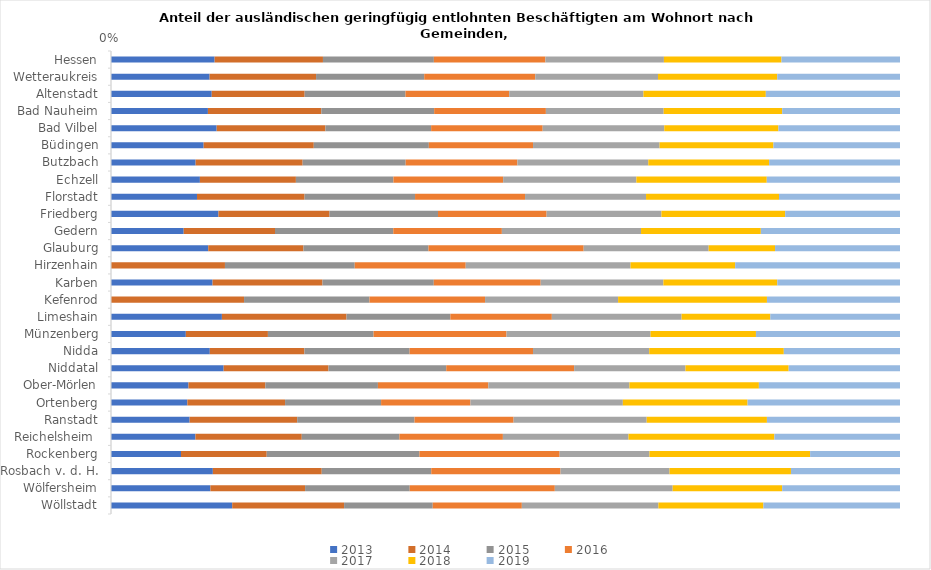
| Category | 2013 | 2014 | 2015 | 2016 | 2017 | 2018 | 2019 |
|---|---|---|---|---|---|---|---|
| Hessen | 0.142 | 0.149 | 0.152 | 0.153 | 0.163 | 0.161 | 0.163 |
| Wetteraukreis | 0.102 | 0.11 | 0.112 | 0.115 | 0.127 | 0.123 | 0.127 |
| Altenstadt | 0.107 | 0.099 | 0.107 | 0.111 | 0.143 | 0.13 | 0.143 |
| Bad Nauheim | 0.137 | 0.16 | 0.16 | 0.158 | 0.167 | 0.168 | 0.167 |
| Bad Vilbel | 0.163 | 0.167 | 0.163 | 0.172 | 0.187 | 0.176 | 0.187 |
| Büdingen | 0.083 | 0.099 | 0.103 | 0.093 | 0.113 | 0.102 | 0.113 |
| Butzbach | 0.071 | 0.09 | 0.087 | 0.094 | 0.11 | 0.101 | 0.11 |
| Echzell | 0.073 | 0.079 | 0.08 | 0.09 | 0.109 | 0.107 | 0.109 |
| Florstadt | 0.053 | 0.066 | 0.068 | 0.068 | 0.074 | 0.082 | 0.074 |
| Friedberg | 0.177 | 0.183 | 0.179 | 0.179 | 0.189 | 0.204 | 0.189 |
| Gedern | 0.045 | 0.056 | 0.073 | 0.067 | 0.086 | 0.074 | 0.086 |
| Glauburg | 0.047 | 0.046 | 0.06 | 0.074 | 0.06 | 0.032 | 0.06 |
| Hirzenhain | 0 | 0.07 | 0.079 | 0.068 | 0.101 | 0.064 | 0.101 |
| Karben | 0.139 | 0.15 | 0.152 | 0.146 | 0.168 | 0.155 | 0.168 |
| Kefenrod | 0 | 0.03 | 0.029 | 0.026 | 0.03 | 0.034 | 0.03 |
| Limeshain | 0.096 | 0.108 | 0.09 | 0.088 | 0.113 | 0.077 | 0.113 |
| Münzenberg | 0.03 | 0.033 | 0.043 | 0.054 | 0.058 | 0.043 | 0.058 |
| Nidda | 0.092 | 0.088 | 0.098 | 0.114 | 0.108 | 0.125 | 0.108 |
| Niddatal | 0.082 | 0.077 | 0.086 | 0.093 | 0.081 | 0.075 | 0.081 |
| Ober-Mörlen | 0.055 | 0.054 | 0.08 | 0.078 | 0.1 | 0.091 | 0.1 |
| Ortenberg | 0.037 | 0.047 | 0.047 | 0.043 | 0.074 | 0.06 | 0.074 |
| Ranstadt | 0.044 | 0.06 | 0.066 | 0.056 | 0.075 | 0.068 | 0.075 |
| Reichelsheim  | 0.066 | 0.083 | 0.076 | 0.081 | 0.098 | 0.114 | 0.098 |
| Rockenberg | 0.02 | 0.025 | 0.044 | 0.041 | 0.026 | 0.047 | 0.026 |
| Rosbach v. d. H. | 0.129 | 0.137 | 0.138 | 0.163 | 0.138 | 0.153 | 0.138 |
| Wölfersheim | 0.045 | 0.043 | 0.047 | 0.065 | 0.053 | 0.049 | 0.053 |
| Wöllstadt | 0.126 | 0.117 | 0.092 | 0.093 | 0.142 | 0.109 | 0.142 |